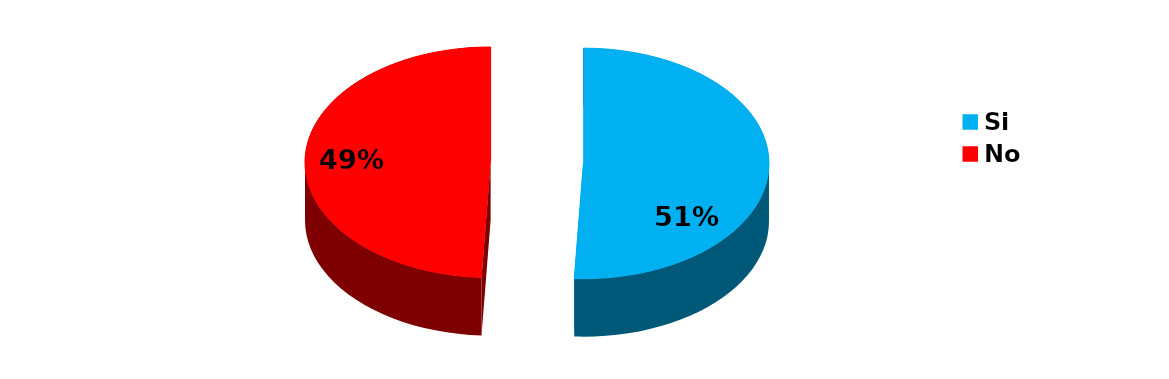
| Category | Series 0 |
|---|---|
| Si | 586 |
| No | 568 |